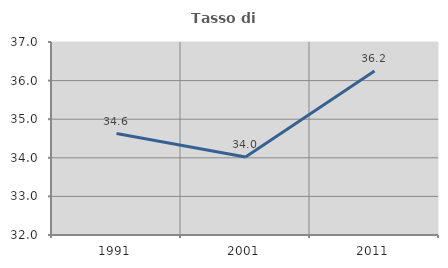
| Category | Tasso di occupazione   |
|---|---|
| 1991.0 | 34.627 |
| 2001.0 | 34.022 |
| 2011.0 | 36.247 |